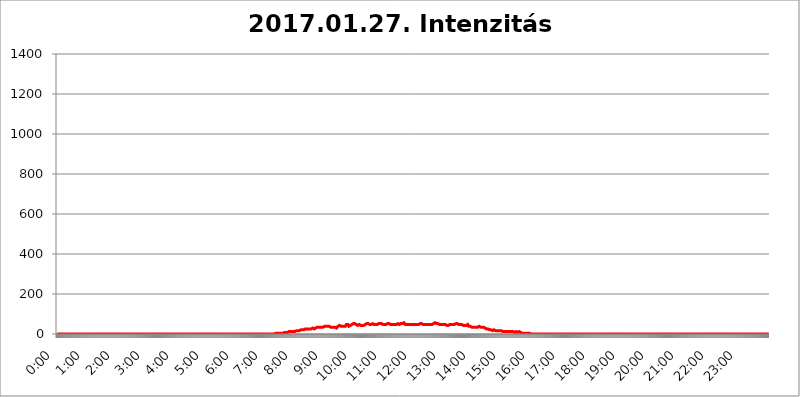
| Category | 2017.01.27. Intenzitás [W/m^2] |
|---|---|
| 0.0 | 0 |
| 0.0006944444444444445 | 0 |
| 0.001388888888888889 | 0 |
| 0.0020833333333333333 | 0 |
| 0.002777777777777778 | 0 |
| 0.003472222222222222 | 0 |
| 0.004166666666666667 | 0 |
| 0.004861111111111111 | 0 |
| 0.005555555555555556 | 0 |
| 0.0062499999999999995 | 0 |
| 0.006944444444444444 | 0 |
| 0.007638888888888889 | 0 |
| 0.008333333333333333 | 0 |
| 0.009027777777777779 | 0 |
| 0.009722222222222222 | 0 |
| 0.010416666666666666 | 0 |
| 0.011111111111111112 | 0 |
| 0.011805555555555555 | 0 |
| 0.012499999999999999 | 0 |
| 0.013194444444444444 | 0 |
| 0.013888888888888888 | 0 |
| 0.014583333333333332 | 0 |
| 0.015277777777777777 | 0 |
| 0.015972222222222224 | 0 |
| 0.016666666666666666 | 0 |
| 0.017361111111111112 | 0 |
| 0.018055555555555557 | 0 |
| 0.01875 | 0 |
| 0.019444444444444445 | 0 |
| 0.02013888888888889 | 0 |
| 0.020833333333333332 | 0 |
| 0.02152777777777778 | 0 |
| 0.022222222222222223 | 0 |
| 0.02291666666666667 | 0 |
| 0.02361111111111111 | 0 |
| 0.024305555555555556 | 0 |
| 0.024999999999999998 | 0 |
| 0.025694444444444447 | 0 |
| 0.02638888888888889 | 0 |
| 0.027083333333333334 | 0 |
| 0.027777777777777776 | 0 |
| 0.02847222222222222 | 0 |
| 0.029166666666666664 | 0 |
| 0.029861111111111113 | 0 |
| 0.030555555555555555 | 0 |
| 0.03125 | 0 |
| 0.03194444444444445 | 0 |
| 0.03263888888888889 | 0 |
| 0.03333333333333333 | 0 |
| 0.034027777777777775 | 0 |
| 0.034722222222222224 | 0 |
| 0.035416666666666666 | 0 |
| 0.036111111111111115 | 0 |
| 0.03680555555555556 | 0 |
| 0.0375 | 0 |
| 0.03819444444444444 | 0 |
| 0.03888888888888889 | 0 |
| 0.03958333333333333 | 0 |
| 0.04027777777777778 | 0 |
| 0.04097222222222222 | 0 |
| 0.041666666666666664 | 0 |
| 0.042361111111111106 | 0 |
| 0.04305555555555556 | 0 |
| 0.043750000000000004 | 0 |
| 0.044444444444444446 | 0 |
| 0.04513888888888889 | 0 |
| 0.04583333333333334 | 0 |
| 0.04652777777777778 | 0 |
| 0.04722222222222222 | 0 |
| 0.04791666666666666 | 0 |
| 0.04861111111111111 | 0 |
| 0.049305555555555554 | 0 |
| 0.049999999999999996 | 0 |
| 0.05069444444444445 | 0 |
| 0.051388888888888894 | 0 |
| 0.052083333333333336 | 0 |
| 0.05277777777777778 | 0 |
| 0.05347222222222222 | 0 |
| 0.05416666666666667 | 0 |
| 0.05486111111111111 | 0 |
| 0.05555555555555555 | 0 |
| 0.05625 | 0 |
| 0.05694444444444444 | 0 |
| 0.057638888888888885 | 0 |
| 0.05833333333333333 | 0 |
| 0.05902777777777778 | 0 |
| 0.059722222222222225 | 0 |
| 0.06041666666666667 | 0 |
| 0.061111111111111116 | 0 |
| 0.06180555555555556 | 0 |
| 0.0625 | 0 |
| 0.06319444444444444 | 0 |
| 0.06388888888888888 | 0 |
| 0.06458333333333334 | 0 |
| 0.06527777777777778 | 0 |
| 0.06597222222222222 | 0 |
| 0.06666666666666667 | 0 |
| 0.06736111111111111 | 0 |
| 0.06805555555555555 | 0 |
| 0.06874999999999999 | 0 |
| 0.06944444444444443 | 0 |
| 0.07013888888888889 | 0 |
| 0.07083333333333333 | 0 |
| 0.07152777777777779 | 0 |
| 0.07222222222222223 | 0 |
| 0.07291666666666667 | 0 |
| 0.07361111111111111 | 0 |
| 0.07430555555555556 | 0 |
| 0.075 | 0 |
| 0.07569444444444444 | 0 |
| 0.0763888888888889 | 0 |
| 0.07708333333333334 | 0 |
| 0.07777777777777778 | 0 |
| 0.07847222222222222 | 0 |
| 0.07916666666666666 | 0 |
| 0.0798611111111111 | 0 |
| 0.08055555555555556 | 0 |
| 0.08125 | 0 |
| 0.08194444444444444 | 0 |
| 0.08263888888888889 | 0 |
| 0.08333333333333333 | 0 |
| 0.08402777777777777 | 0 |
| 0.08472222222222221 | 0 |
| 0.08541666666666665 | 0 |
| 0.08611111111111112 | 0 |
| 0.08680555555555557 | 0 |
| 0.08750000000000001 | 0 |
| 0.08819444444444445 | 0 |
| 0.08888888888888889 | 0 |
| 0.08958333333333333 | 0 |
| 0.09027777777777778 | 0 |
| 0.09097222222222222 | 0 |
| 0.09166666666666667 | 0 |
| 0.09236111111111112 | 0 |
| 0.09305555555555556 | 0 |
| 0.09375 | 0 |
| 0.09444444444444444 | 0 |
| 0.09513888888888888 | 0 |
| 0.09583333333333333 | 0 |
| 0.09652777777777777 | 0 |
| 0.09722222222222222 | 0 |
| 0.09791666666666667 | 0 |
| 0.09861111111111111 | 0 |
| 0.09930555555555555 | 0 |
| 0.09999999999999999 | 0 |
| 0.10069444444444443 | 0 |
| 0.1013888888888889 | 0 |
| 0.10208333333333335 | 0 |
| 0.10277777777777779 | 0 |
| 0.10347222222222223 | 0 |
| 0.10416666666666667 | 0 |
| 0.10486111111111111 | 0 |
| 0.10555555555555556 | 0 |
| 0.10625 | 0 |
| 0.10694444444444444 | 0 |
| 0.1076388888888889 | 0 |
| 0.10833333333333334 | 0 |
| 0.10902777777777778 | 0 |
| 0.10972222222222222 | 0 |
| 0.1111111111111111 | 0 |
| 0.11180555555555556 | 0 |
| 0.11180555555555556 | 0 |
| 0.1125 | 0 |
| 0.11319444444444444 | 0 |
| 0.11388888888888889 | 0 |
| 0.11458333333333333 | 0 |
| 0.11527777777777777 | 0 |
| 0.11597222222222221 | 0 |
| 0.11666666666666665 | 0 |
| 0.1173611111111111 | 0 |
| 0.11805555555555557 | 0 |
| 0.11944444444444445 | 0 |
| 0.12013888888888889 | 0 |
| 0.12083333333333333 | 0 |
| 0.12152777777777778 | 0 |
| 0.12222222222222223 | 0 |
| 0.12291666666666667 | 0 |
| 0.12291666666666667 | 0 |
| 0.12361111111111112 | 0 |
| 0.12430555555555556 | 0 |
| 0.125 | 0 |
| 0.12569444444444444 | 0 |
| 0.12638888888888888 | 0 |
| 0.12708333333333333 | 0 |
| 0.16875 | 0 |
| 0.12847222222222224 | 0 |
| 0.12916666666666668 | 0 |
| 0.12986111111111112 | 0 |
| 0.13055555555555556 | 0 |
| 0.13125 | 0 |
| 0.13194444444444445 | 0 |
| 0.1326388888888889 | 0 |
| 0.13333333333333333 | 0 |
| 0.13402777777777777 | 0 |
| 0.13402777777777777 | 0 |
| 0.13472222222222222 | 0 |
| 0.13541666666666666 | 0 |
| 0.1361111111111111 | 0 |
| 0.13749999999999998 | 0 |
| 0.13819444444444443 | 0 |
| 0.1388888888888889 | 0 |
| 0.13958333333333334 | 0 |
| 0.14027777777777778 | 0 |
| 0.14097222222222222 | 0 |
| 0.14166666666666666 | 0 |
| 0.1423611111111111 | 0 |
| 0.14305555555555557 | 0 |
| 0.14375000000000002 | 0 |
| 0.14444444444444446 | 0 |
| 0.1451388888888889 | 0 |
| 0.1451388888888889 | 0 |
| 0.14652777777777778 | 0 |
| 0.14722222222222223 | 0 |
| 0.14791666666666667 | 0 |
| 0.1486111111111111 | 0 |
| 0.14930555555555555 | 0 |
| 0.15 | 0 |
| 0.15069444444444444 | 0 |
| 0.15138888888888888 | 0 |
| 0.15208333333333332 | 0 |
| 0.15277777777777776 | 0 |
| 0.15347222222222223 | 0 |
| 0.15416666666666667 | 0 |
| 0.15486111111111112 | 0 |
| 0.15555555555555556 | 0 |
| 0.15625 | 0 |
| 0.15694444444444444 | 0 |
| 0.15763888888888888 | 0 |
| 0.15833333333333333 | 0 |
| 0.15902777777777777 | 0 |
| 0.15972222222222224 | 0 |
| 0.16041666666666668 | 0 |
| 0.16111111111111112 | 0 |
| 0.16180555555555556 | 0 |
| 0.1625 | 0 |
| 0.16319444444444445 | 0 |
| 0.1638888888888889 | 0 |
| 0.16458333333333333 | 0 |
| 0.16527777777777777 | 0 |
| 0.16597222222222222 | 0 |
| 0.16666666666666666 | 0 |
| 0.1673611111111111 | 0 |
| 0.16805555555555554 | 0 |
| 0.16874999999999998 | 0 |
| 0.16944444444444443 | 0 |
| 0.17013888888888887 | 0 |
| 0.1708333333333333 | 0 |
| 0.17152777777777775 | 0 |
| 0.17222222222222225 | 0 |
| 0.1729166666666667 | 0 |
| 0.17361111111111113 | 0 |
| 0.17430555555555557 | 0 |
| 0.17500000000000002 | 0 |
| 0.17569444444444446 | 0 |
| 0.1763888888888889 | 0 |
| 0.17708333333333334 | 0 |
| 0.17777777777777778 | 0 |
| 0.17847222222222223 | 0 |
| 0.17916666666666667 | 0 |
| 0.1798611111111111 | 0 |
| 0.18055555555555555 | 0 |
| 0.18125 | 0 |
| 0.18194444444444444 | 0 |
| 0.1826388888888889 | 0 |
| 0.18333333333333335 | 0 |
| 0.1840277777777778 | 0 |
| 0.18472222222222223 | 0 |
| 0.18541666666666667 | 0 |
| 0.18611111111111112 | 0 |
| 0.18680555555555556 | 0 |
| 0.1875 | 0 |
| 0.18819444444444444 | 0 |
| 0.18888888888888888 | 0 |
| 0.18958333333333333 | 0 |
| 0.19027777777777777 | 0 |
| 0.1909722222222222 | 0 |
| 0.19166666666666665 | 0 |
| 0.19236111111111112 | 0 |
| 0.19305555555555554 | 0 |
| 0.19375 | 0 |
| 0.19444444444444445 | 0 |
| 0.1951388888888889 | 0 |
| 0.19583333333333333 | 0 |
| 0.19652777777777777 | 0 |
| 0.19722222222222222 | 0 |
| 0.19791666666666666 | 0 |
| 0.1986111111111111 | 0 |
| 0.19930555555555554 | 0 |
| 0.19999999999999998 | 0 |
| 0.20069444444444443 | 0 |
| 0.20138888888888887 | 0 |
| 0.2020833333333333 | 0 |
| 0.2027777777777778 | 0 |
| 0.2034722222222222 | 0 |
| 0.2041666666666667 | 0 |
| 0.20486111111111113 | 0 |
| 0.20555555555555557 | 0 |
| 0.20625000000000002 | 0 |
| 0.20694444444444446 | 0 |
| 0.2076388888888889 | 0 |
| 0.20833333333333334 | 0 |
| 0.20902777777777778 | 0 |
| 0.20972222222222223 | 0 |
| 0.21041666666666667 | 0 |
| 0.2111111111111111 | 0 |
| 0.21180555555555555 | 0 |
| 0.2125 | 0 |
| 0.21319444444444444 | 0 |
| 0.2138888888888889 | 0 |
| 0.21458333333333335 | 0 |
| 0.2152777777777778 | 0 |
| 0.21597222222222223 | 0 |
| 0.21666666666666667 | 0 |
| 0.21736111111111112 | 0 |
| 0.21805555555555556 | 0 |
| 0.21875 | 0 |
| 0.21944444444444444 | 0 |
| 0.22013888888888888 | 0 |
| 0.22083333333333333 | 0 |
| 0.22152777777777777 | 0 |
| 0.2222222222222222 | 0 |
| 0.22291666666666665 | 0 |
| 0.2236111111111111 | 0 |
| 0.22430555555555556 | 0 |
| 0.225 | 0 |
| 0.22569444444444445 | 0 |
| 0.2263888888888889 | 0 |
| 0.22708333333333333 | 0 |
| 0.22777777777777777 | 0 |
| 0.22847222222222222 | 0 |
| 0.22916666666666666 | 0 |
| 0.2298611111111111 | 0 |
| 0.23055555555555554 | 0 |
| 0.23124999999999998 | 0 |
| 0.23194444444444443 | 0 |
| 0.23263888888888887 | 0 |
| 0.2333333333333333 | 0 |
| 0.2340277777777778 | 0 |
| 0.2347222222222222 | 0 |
| 0.2354166666666667 | 0 |
| 0.23611111111111113 | 0 |
| 0.23680555555555557 | 0 |
| 0.23750000000000002 | 0 |
| 0.23819444444444446 | 0 |
| 0.2388888888888889 | 0 |
| 0.23958333333333334 | 0 |
| 0.24027777777777778 | 0 |
| 0.24097222222222223 | 0 |
| 0.24166666666666667 | 0 |
| 0.2423611111111111 | 0 |
| 0.24305555555555555 | 0 |
| 0.24375 | 0 |
| 0.24444444444444446 | 0 |
| 0.24513888888888888 | 0 |
| 0.24583333333333335 | 0 |
| 0.2465277777777778 | 0 |
| 0.24722222222222223 | 0 |
| 0.24791666666666667 | 0 |
| 0.24861111111111112 | 0 |
| 0.24930555555555556 | 0 |
| 0.25 | 0 |
| 0.25069444444444444 | 0 |
| 0.2513888888888889 | 0 |
| 0.2520833333333333 | 0 |
| 0.25277777777777777 | 0 |
| 0.2534722222222222 | 0 |
| 0.25416666666666665 | 0 |
| 0.2548611111111111 | 0 |
| 0.2555555555555556 | 0 |
| 0.25625000000000003 | 0 |
| 0.2569444444444445 | 0 |
| 0.2576388888888889 | 0 |
| 0.25833333333333336 | 0 |
| 0.2590277777777778 | 0 |
| 0.25972222222222224 | 0 |
| 0.2604166666666667 | 0 |
| 0.2611111111111111 | 0 |
| 0.26180555555555557 | 0 |
| 0.2625 | 0 |
| 0.26319444444444445 | 0 |
| 0.2638888888888889 | 0 |
| 0.26458333333333334 | 0 |
| 0.2652777777777778 | 0 |
| 0.2659722222222222 | 0 |
| 0.26666666666666666 | 0 |
| 0.2673611111111111 | 0 |
| 0.26805555555555555 | 0 |
| 0.26875 | 0 |
| 0.26944444444444443 | 0 |
| 0.2701388888888889 | 0 |
| 0.2708333333333333 | 0 |
| 0.27152777777777776 | 0 |
| 0.2722222222222222 | 0 |
| 0.27291666666666664 | 0 |
| 0.2736111111111111 | 0 |
| 0.2743055555555555 | 0 |
| 0.27499999999999997 | 0 |
| 0.27569444444444446 | 0 |
| 0.27638888888888885 | 0 |
| 0.27708333333333335 | 0 |
| 0.2777777777777778 | 0 |
| 0.27847222222222223 | 0 |
| 0.2791666666666667 | 0 |
| 0.2798611111111111 | 0 |
| 0.28055555555555556 | 0 |
| 0.28125 | 0 |
| 0.28194444444444444 | 0 |
| 0.2826388888888889 | 0 |
| 0.2833333333333333 | 0 |
| 0.28402777777777777 | 0 |
| 0.2847222222222222 | 0 |
| 0.28541666666666665 | 0 |
| 0.28611111111111115 | 0 |
| 0.28680555555555554 | 0 |
| 0.28750000000000003 | 0 |
| 0.2881944444444445 | 0 |
| 0.2888888888888889 | 0 |
| 0.28958333333333336 | 0 |
| 0.2902777777777778 | 0 |
| 0.29097222222222224 | 0 |
| 0.2916666666666667 | 0 |
| 0.2923611111111111 | 0 |
| 0.29305555555555557 | 0 |
| 0.29375 | 0 |
| 0.29444444444444445 | 0 |
| 0.2951388888888889 | 0 |
| 0.29583333333333334 | 0 |
| 0.2965277777777778 | 0 |
| 0.2972222222222222 | 0 |
| 0.29791666666666666 | 0 |
| 0.2986111111111111 | 0 |
| 0.29930555555555555 | 0 |
| 0.3 | 0 |
| 0.30069444444444443 | 0 |
| 0.3013888888888889 | 0 |
| 0.3020833333333333 | 0 |
| 0.30277777777777776 | 0 |
| 0.3034722222222222 | 0 |
| 0.30416666666666664 | 0 |
| 0.3048611111111111 | 0 |
| 0.3055555555555555 | 0 |
| 0.30624999999999997 | 3.525 |
| 0.3069444444444444 | 3.525 |
| 0.3076388888888889 | 3.525 |
| 0.30833333333333335 | 3.525 |
| 0.3090277777777778 | 3.525 |
| 0.30972222222222223 | 3.525 |
| 0.3104166666666667 | 3.525 |
| 0.3111111111111111 | 3.525 |
| 0.31180555555555556 | 3.525 |
| 0.3125 | 3.525 |
| 0.31319444444444444 | 3.525 |
| 0.3138888888888889 | 3.525 |
| 0.3145833333333333 | 3.525 |
| 0.31527777777777777 | 3.525 |
| 0.3159722222222222 | 3.525 |
| 0.31666666666666665 | 3.525 |
| 0.31736111111111115 | 7.887 |
| 0.31805555555555554 | 7.887 |
| 0.31875000000000003 | 7.887 |
| 0.3194444444444445 | 7.887 |
| 0.3201388888888889 | 7.887 |
| 0.32083333333333336 | 7.887 |
| 0.3215277777777778 | 7.887 |
| 0.32222222222222224 | 7.887 |
| 0.3229166666666667 | 7.887 |
| 0.3236111111111111 | 7.887 |
| 0.32430555555555557 | 7.887 |
| 0.325 | 12.257 |
| 0.32569444444444445 | 12.257 |
| 0.3263888888888889 | 7.887 |
| 0.32708333333333334 | 12.257 |
| 0.3277777777777778 | 12.257 |
| 0.3284722222222222 | 12.257 |
| 0.32916666666666666 | 12.257 |
| 0.3298611111111111 | 12.257 |
| 0.33055555555555555 | 12.257 |
| 0.33125 | 12.257 |
| 0.33194444444444443 | 12.257 |
| 0.3326388888888889 | 12.257 |
| 0.3333333333333333 | 12.257 |
| 0.3340277777777778 | 12.257 |
| 0.3347222222222222 | 12.257 |
| 0.3354166666666667 | 16.636 |
| 0.3361111111111111 | 16.636 |
| 0.3368055555555556 | 16.636 |
| 0.33749999999999997 | 16.636 |
| 0.33819444444444446 | 16.636 |
| 0.33888888888888885 | 16.636 |
| 0.33958333333333335 | 16.636 |
| 0.34027777777777773 | 16.636 |
| 0.34097222222222223 | 21.024 |
| 0.3416666666666666 | 21.024 |
| 0.3423611111111111 | 21.024 |
| 0.3430555555555555 | 21.024 |
| 0.34375 | 21.024 |
| 0.3444444444444445 | 21.024 |
| 0.3451388888888889 | 21.024 |
| 0.3458333333333334 | 21.024 |
| 0.34652777777777777 | 21.024 |
| 0.34722222222222227 | 21.024 |
| 0.34791666666666665 | 25.419 |
| 0.34861111111111115 | 25.419 |
| 0.34930555555555554 | 21.024 |
| 0.35000000000000003 | 25.419 |
| 0.3506944444444444 | 25.419 |
| 0.3513888888888889 | 21.024 |
| 0.3520833333333333 | 25.419 |
| 0.3527777777777778 | 25.419 |
| 0.3534722222222222 | 25.419 |
| 0.3541666666666667 | 25.419 |
| 0.3548611111111111 | 25.419 |
| 0.35555555555555557 | 25.419 |
| 0.35625 | 25.419 |
| 0.35694444444444445 | 29.823 |
| 0.3576388888888889 | 29.823 |
| 0.35833333333333334 | 29.823 |
| 0.3590277777777778 | 29.823 |
| 0.3597222222222222 | 29.823 |
| 0.36041666666666666 | 25.419 |
| 0.3611111111111111 | 29.823 |
| 0.36180555555555555 | 29.823 |
| 0.3625 | 29.823 |
| 0.36319444444444443 | 29.823 |
| 0.3638888888888889 | 34.234 |
| 0.3645833333333333 | 34.234 |
| 0.3652777777777778 | 34.234 |
| 0.3659722222222222 | 34.234 |
| 0.3666666666666667 | 34.234 |
| 0.3673611111111111 | 38.653 |
| 0.3680555555555556 | 38.653 |
| 0.36874999999999997 | 34.234 |
| 0.36944444444444446 | 34.234 |
| 0.37013888888888885 | 38.653 |
| 0.37083333333333335 | 34.234 |
| 0.37152777777777773 | 34.234 |
| 0.37222222222222223 | 34.234 |
| 0.3729166666666666 | 34.234 |
| 0.3736111111111111 | 34.234 |
| 0.3743055555555555 | 38.653 |
| 0.375 | 38.653 |
| 0.3756944444444445 | 38.653 |
| 0.3763888888888889 | 38.653 |
| 0.3770833333333334 | 38.653 |
| 0.37777777777777777 | 38.653 |
| 0.37847222222222227 | 38.653 |
| 0.37916666666666665 | 38.653 |
| 0.37986111111111115 | 38.653 |
| 0.38055555555555554 | 38.653 |
| 0.38125000000000003 | 38.653 |
| 0.3819444444444444 | 38.653 |
| 0.3826388888888889 | 34.234 |
| 0.3833333333333333 | 34.234 |
| 0.3840277777777778 | 38.653 |
| 0.3847222222222222 | 34.234 |
| 0.3854166666666667 | 34.234 |
| 0.3861111111111111 | 34.234 |
| 0.38680555555555557 | 34.234 |
| 0.3875 | 34.234 |
| 0.38819444444444445 | 34.234 |
| 0.3888888888888889 | 29.823 |
| 0.38958333333333334 | 34.234 |
| 0.3902777777777778 | 29.823 |
| 0.3909722222222222 | 29.823 |
| 0.39166666666666666 | 29.823 |
| 0.3923611111111111 | 34.234 |
| 0.39305555555555555 | 34.234 |
| 0.39375 | 38.653 |
| 0.39444444444444443 | 38.653 |
| 0.3951388888888889 | 38.653 |
| 0.3958333333333333 | 43.079 |
| 0.3965277777777778 | 43.079 |
| 0.3972222222222222 | 43.079 |
| 0.3979166666666667 | 38.653 |
| 0.3986111111111111 | 38.653 |
| 0.3993055555555556 | 38.653 |
| 0.39999999999999997 | 38.653 |
| 0.40069444444444446 | 38.653 |
| 0.40138888888888885 | 38.653 |
| 0.40208333333333335 | 38.653 |
| 0.40277777777777773 | 38.653 |
| 0.40347222222222223 | 38.653 |
| 0.4041666666666666 | 38.653 |
| 0.4048611111111111 | 43.079 |
| 0.4055555555555555 | 47.511 |
| 0.40625 | 47.511 |
| 0.4069444444444445 | 47.511 |
| 0.4076388888888889 | 47.511 |
| 0.4083333333333334 | 43.079 |
| 0.40902777777777777 | 38.653 |
| 0.40972222222222227 | 38.653 |
| 0.41041666666666665 | 43.079 |
| 0.41111111111111115 | 43.079 |
| 0.41180555555555554 | 47.511 |
| 0.41250000000000003 | 47.511 |
| 0.4131944444444444 | 47.511 |
| 0.4138888888888889 | 47.511 |
| 0.4145833333333333 | 51.951 |
| 0.4152777777777778 | 51.951 |
| 0.4159722222222222 | 51.951 |
| 0.4166666666666667 | 51.951 |
| 0.4173611111111111 | 51.951 |
| 0.41805555555555557 | 47.511 |
| 0.41875 | 47.511 |
| 0.41944444444444445 | 47.511 |
| 0.4201388888888889 | 47.511 |
| 0.42083333333333334 | 47.511 |
| 0.4215277777777778 | 43.079 |
| 0.4222222222222222 | 47.511 |
| 0.42291666666666666 | 47.511 |
| 0.4236111111111111 | 47.511 |
| 0.42430555555555555 | 47.511 |
| 0.425 | 47.511 |
| 0.42569444444444443 | 43.079 |
| 0.4263888888888889 | 43.079 |
| 0.4270833333333333 | 43.079 |
| 0.4277777777777778 | 43.079 |
| 0.4284722222222222 | 43.079 |
| 0.4291666666666667 | 43.079 |
| 0.4298611111111111 | 43.079 |
| 0.4305555555555556 | 43.079 |
| 0.43124999999999997 | 43.079 |
| 0.43194444444444446 | 47.511 |
| 0.43263888888888885 | 47.511 |
| 0.43333333333333335 | 47.511 |
| 0.43402777777777773 | 51.951 |
| 0.43472222222222223 | 51.951 |
| 0.4354166666666666 | 51.951 |
| 0.4361111111111111 | 51.951 |
| 0.4368055555555555 | 47.511 |
| 0.4375 | 51.951 |
| 0.4381944444444445 | 47.511 |
| 0.4388888888888889 | 51.951 |
| 0.4395833333333334 | 51.951 |
| 0.44027777777777777 | 47.511 |
| 0.44097222222222227 | 51.951 |
| 0.44166666666666665 | 51.951 |
| 0.44236111111111115 | 51.951 |
| 0.44305555555555554 | 47.511 |
| 0.44375000000000003 | 47.511 |
| 0.4444444444444444 | 47.511 |
| 0.4451388888888889 | 47.511 |
| 0.4458333333333333 | 47.511 |
| 0.4465277777777778 | 47.511 |
| 0.4472222222222222 | 47.511 |
| 0.4479166666666667 | 47.511 |
| 0.4486111111111111 | 47.511 |
| 0.44930555555555557 | 47.511 |
| 0.45 | 47.511 |
| 0.45069444444444445 | 51.951 |
| 0.4513888888888889 | 51.951 |
| 0.45208333333333334 | 51.951 |
| 0.4527777777777778 | 51.951 |
| 0.4534722222222222 | 51.951 |
| 0.45416666666666666 | 47.511 |
| 0.4548611111111111 | 51.951 |
| 0.45555555555555555 | 51.951 |
| 0.45625 | 47.511 |
| 0.45694444444444443 | 47.511 |
| 0.4576388888888889 | 47.511 |
| 0.4583333333333333 | 47.511 |
| 0.4590277777777778 | 47.511 |
| 0.4597222222222222 | 47.511 |
| 0.4604166666666667 | 47.511 |
| 0.4611111111111111 | 47.511 |
| 0.4618055555555556 | 47.511 |
| 0.46249999999999997 | 51.951 |
| 0.46319444444444446 | 51.951 |
| 0.46388888888888885 | 56.398 |
| 0.46458333333333335 | 56.398 |
| 0.46527777777777773 | 51.951 |
| 0.46597222222222223 | 47.511 |
| 0.4666666666666666 | 47.511 |
| 0.4673611111111111 | 47.511 |
| 0.4680555555555555 | 47.511 |
| 0.46875 | 47.511 |
| 0.4694444444444445 | 47.511 |
| 0.4701388888888889 | 47.511 |
| 0.4708333333333334 | 47.511 |
| 0.47152777777777777 | 47.511 |
| 0.47222222222222227 | 47.511 |
| 0.47291666666666665 | 47.511 |
| 0.47361111111111115 | 47.511 |
| 0.47430555555555554 | 47.511 |
| 0.47500000000000003 | 47.511 |
| 0.4756944444444444 | 47.511 |
| 0.4763888888888889 | 47.511 |
| 0.4770833333333333 | 51.951 |
| 0.4777777777777778 | 51.951 |
| 0.4784722222222222 | 47.511 |
| 0.4791666666666667 | 47.511 |
| 0.4798611111111111 | 47.511 |
| 0.48055555555555557 | 51.951 |
| 0.48125 | 47.511 |
| 0.48194444444444445 | 51.951 |
| 0.4826388888888889 | 51.951 |
| 0.48333333333333334 | 51.951 |
| 0.4840277777777778 | 51.951 |
| 0.4847222222222222 | 51.951 |
| 0.48541666666666666 | 56.398 |
| 0.4861111111111111 | 56.398 |
| 0.48680555555555555 | 56.398 |
| 0.4875 | 51.951 |
| 0.48819444444444443 | 47.511 |
| 0.4888888888888889 | 47.511 |
| 0.4895833333333333 | 47.511 |
| 0.4902777777777778 | 47.511 |
| 0.4909722222222222 | 47.511 |
| 0.4916666666666667 | 47.511 |
| 0.4923611111111111 | 47.511 |
| 0.4930555555555556 | 47.511 |
| 0.49374999999999997 | 47.511 |
| 0.49444444444444446 | 47.511 |
| 0.49513888888888885 | 47.511 |
| 0.49583333333333335 | 47.511 |
| 0.49652777777777773 | 47.511 |
| 0.49722222222222223 | 47.511 |
| 0.4979166666666666 | 51.951 |
| 0.4986111111111111 | 47.511 |
| 0.4993055555555555 | 47.511 |
| 0.5 | 47.511 |
| 0.5006944444444444 | 47.511 |
| 0.5013888888888889 | 47.511 |
| 0.5020833333333333 | 47.511 |
| 0.5027777777777778 | 47.511 |
| 0.5034722222222222 | 47.511 |
| 0.5041666666666667 | 47.511 |
| 0.5048611111111111 | 47.511 |
| 0.5055555555555555 | 47.511 |
| 0.50625 | 47.511 |
| 0.5069444444444444 | 47.511 |
| 0.5076388888888889 | 47.511 |
| 0.5083333333333333 | 51.951 |
| 0.5090277777777777 | 51.951 |
| 0.5097222222222222 | 51.951 |
| 0.5104166666666666 | 51.951 |
| 0.5111111111111112 | 51.951 |
| 0.5118055555555555 | 51.951 |
| 0.5125000000000001 | 51.951 |
| 0.5131944444444444 | 47.511 |
| 0.513888888888889 | 47.511 |
| 0.5145833333333333 | 47.511 |
| 0.5152777777777778 | 47.511 |
| 0.5159722222222222 | 47.511 |
| 0.5166666666666667 | 47.511 |
| 0.517361111111111 | 47.511 |
| 0.5180555555555556 | 47.511 |
| 0.5187499999999999 | 47.511 |
| 0.5194444444444445 | 47.511 |
| 0.5201388888888888 | 47.511 |
| 0.5208333333333334 | 47.511 |
| 0.5215277777777778 | 47.511 |
| 0.5222222222222223 | 47.511 |
| 0.5229166666666667 | 47.511 |
| 0.5236111111111111 | 47.511 |
| 0.5243055555555556 | 47.511 |
| 0.525 | 47.511 |
| 0.5256944444444445 | 47.511 |
| 0.5263888888888889 | 51.951 |
| 0.5270833333333333 | 51.951 |
| 0.5277777777777778 | 51.951 |
| 0.5284722222222222 | 56.398 |
| 0.5291666666666667 | 56.398 |
| 0.5298611111111111 | 56.398 |
| 0.5305555555555556 | 56.398 |
| 0.53125 | 51.951 |
| 0.5319444444444444 | 51.951 |
| 0.5326388888888889 | 51.951 |
| 0.5333333333333333 | 51.951 |
| 0.5340277777777778 | 51.951 |
| 0.5347222222222222 | 47.511 |
| 0.5354166666666667 | 47.511 |
| 0.5361111111111111 | 47.511 |
| 0.5368055555555555 | 47.511 |
| 0.5375 | 47.511 |
| 0.5381944444444444 | 47.511 |
| 0.5388888888888889 | 47.511 |
| 0.5395833333333333 | 47.511 |
| 0.5402777777777777 | 47.511 |
| 0.5409722222222222 | 47.511 |
| 0.5416666666666666 | 47.511 |
| 0.5423611111111112 | 47.511 |
| 0.5430555555555555 | 47.511 |
| 0.5437500000000001 | 47.511 |
| 0.5444444444444444 | 47.511 |
| 0.545138888888889 | 43.079 |
| 0.5458333333333333 | 43.079 |
| 0.5465277777777778 | 43.079 |
| 0.5472222222222222 | 43.079 |
| 0.5479166666666667 | 43.079 |
| 0.548611111111111 | 43.079 |
| 0.5493055555555556 | 47.511 |
| 0.5499999999999999 | 47.511 |
| 0.5506944444444445 | 47.511 |
| 0.5513888888888888 | 47.511 |
| 0.5520833333333334 | 47.511 |
| 0.5527777777777778 | 47.511 |
| 0.5534722222222223 | 47.511 |
| 0.5541666666666667 | 47.511 |
| 0.5548611111111111 | 47.511 |
| 0.5555555555555556 | 47.511 |
| 0.55625 | 47.511 |
| 0.5569444444444445 | 47.511 |
| 0.5576388888888889 | 51.951 |
| 0.5583333333333333 | 51.951 |
| 0.5590277777777778 | 51.951 |
| 0.5597222222222222 | 51.951 |
| 0.5604166666666667 | 51.951 |
| 0.5611111111111111 | 51.951 |
| 0.5618055555555556 | 51.951 |
| 0.5625 | 47.511 |
| 0.5631944444444444 | 47.511 |
| 0.5638888888888889 | 47.511 |
| 0.5645833333333333 | 47.511 |
| 0.5652777777777778 | 47.511 |
| 0.5659722222222222 | 47.511 |
| 0.5666666666666667 | 47.511 |
| 0.5673611111111111 | 47.511 |
| 0.5680555555555555 | 47.511 |
| 0.56875 | 47.511 |
| 0.5694444444444444 | 43.079 |
| 0.5701388888888889 | 43.079 |
| 0.5708333333333333 | 43.079 |
| 0.5715277777777777 | 43.079 |
| 0.5722222222222222 | 43.079 |
| 0.5729166666666666 | 43.079 |
| 0.5736111111111112 | 43.079 |
| 0.5743055555555555 | 43.079 |
| 0.5750000000000001 | 47.511 |
| 0.5756944444444444 | 47.511 |
| 0.576388888888889 | 43.079 |
| 0.5770833333333333 | 38.653 |
| 0.5777777777777778 | 38.653 |
| 0.5784722222222222 | 38.653 |
| 0.5791666666666667 | 38.653 |
| 0.579861111111111 | 38.653 |
| 0.5805555555555556 | 38.653 |
| 0.5812499999999999 | 34.234 |
| 0.5819444444444445 | 34.234 |
| 0.5826388888888888 | 34.234 |
| 0.5833333333333334 | 34.234 |
| 0.5840277777777778 | 29.823 |
| 0.5847222222222223 | 34.234 |
| 0.5854166666666667 | 34.234 |
| 0.5861111111111111 | 34.234 |
| 0.5868055555555556 | 34.234 |
| 0.5875 | 34.234 |
| 0.5881944444444445 | 34.234 |
| 0.5888888888888889 | 38.653 |
| 0.5895833333333333 | 34.234 |
| 0.5902777777777778 | 38.653 |
| 0.5909722222222222 | 38.653 |
| 0.5916666666666667 | 38.653 |
| 0.5923611111111111 | 38.653 |
| 0.5930555555555556 | 38.653 |
| 0.59375 | 34.234 |
| 0.5944444444444444 | 34.234 |
| 0.5951388888888889 | 34.234 |
| 0.5958333333333333 | 34.234 |
| 0.5965277777777778 | 34.234 |
| 0.5972222222222222 | 29.823 |
| 0.5979166666666667 | 34.234 |
| 0.5986111111111111 | 29.823 |
| 0.5993055555555555 | 29.823 |
| 0.6 | 29.823 |
| 0.6006944444444444 | 29.823 |
| 0.6013888888888889 | 29.823 |
| 0.6020833333333333 | 25.419 |
| 0.6027777777777777 | 25.419 |
| 0.6034722222222222 | 25.419 |
| 0.6041666666666666 | 25.419 |
| 0.6048611111111112 | 25.419 |
| 0.6055555555555555 | 21.024 |
| 0.6062500000000001 | 21.024 |
| 0.6069444444444444 | 21.024 |
| 0.607638888888889 | 21.024 |
| 0.6083333333333333 | 21.024 |
| 0.6090277777777778 | 21.024 |
| 0.6097222222222222 | 16.636 |
| 0.6104166666666667 | 16.636 |
| 0.611111111111111 | 16.636 |
| 0.6118055555555556 | 21.024 |
| 0.6124999999999999 | 21.024 |
| 0.6131944444444445 | 21.024 |
| 0.6138888888888888 | 16.636 |
| 0.6145833333333334 | 16.636 |
| 0.6152777777777778 | 16.636 |
| 0.6159722222222223 | 16.636 |
| 0.6166666666666667 | 16.636 |
| 0.6173611111111111 | 16.636 |
| 0.6180555555555556 | 16.636 |
| 0.61875 | 16.636 |
| 0.6194444444444445 | 16.636 |
| 0.6201388888888889 | 16.636 |
| 0.6208333333333333 | 16.636 |
| 0.6215277777777778 | 16.636 |
| 0.6222222222222222 | 12.257 |
| 0.6229166666666667 | 16.636 |
| 0.6236111111111111 | 12.257 |
| 0.6243055555555556 | 12.257 |
| 0.625 | 12.257 |
| 0.6256944444444444 | 12.257 |
| 0.6263888888888889 | 12.257 |
| 0.6270833333333333 | 12.257 |
| 0.6277777777777778 | 12.257 |
| 0.6284722222222222 | 12.257 |
| 0.6291666666666667 | 12.257 |
| 0.6298611111111111 | 12.257 |
| 0.6305555555555555 | 12.257 |
| 0.63125 | 12.257 |
| 0.6319444444444444 | 12.257 |
| 0.6326388888888889 | 12.257 |
| 0.6333333333333333 | 12.257 |
| 0.6340277777777777 | 12.257 |
| 0.6347222222222222 | 12.257 |
| 0.6354166666666666 | 12.257 |
| 0.6361111111111112 | 12.257 |
| 0.6368055555555555 | 12.257 |
| 0.6375000000000001 | 12.257 |
| 0.6381944444444444 | 12.257 |
| 0.638888888888889 | 12.257 |
| 0.6395833333333333 | 12.257 |
| 0.6402777777777778 | 12.257 |
| 0.6409722222222222 | 12.257 |
| 0.6416666666666667 | 7.887 |
| 0.642361111111111 | 12.257 |
| 0.6430555555555556 | 7.887 |
| 0.6437499999999999 | 12.257 |
| 0.6444444444444445 | 12.257 |
| 0.6451388888888888 | 7.887 |
| 0.6458333333333334 | 7.887 |
| 0.6465277777777778 | 7.887 |
| 0.6472222222222223 | 7.887 |
| 0.6479166666666667 | 12.257 |
| 0.6486111111111111 | 7.887 |
| 0.6493055555555556 | 7.887 |
| 0.65 | 7.887 |
| 0.6506944444444445 | 3.525 |
| 0.6513888888888889 | 3.525 |
| 0.6520833333333333 | 3.525 |
| 0.6527777777777778 | 3.525 |
| 0.6534722222222222 | 3.525 |
| 0.6541666666666667 | 3.525 |
| 0.6548611111111111 | 3.525 |
| 0.6555555555555556 | 3.525 |
| 0.65625 | 3.525 |
| 0.6569444444444444 | 3.525 |
| 0.6576388888888889 | 3.525 |
| 0.6583333333333333 | 3.525 |
| 0.6590277777777778 | 3.525 |
| 0.6597222222222222 | 3.525 |
| 0.6604166666666667 | 3.525 |
| 0.6611111111111111 | 3.525 |
| 0.6618055555555555 | 3.525 |
| 0.6625 | 3.525 |
| 0.6631944444444444 | 0 |
| 0.6638888888888889 | 0 |
| 0.6645833333333333 | 0 |
| 0.6652777777777777 | 0 |
| 0.6659722222222222 | 0 |
| 0.6666666666666666 | 0 |
| 0.6673611111111111 | 0 |
| 0.6680555555555556 | 0 |
| 0.6687500000000001 | 0 |
| 0.6694444444444444 | 0 |
| 0.6701388888888888 | 0 |
| 0.6708333333333334 | 0 |
| 0.6715277777777778 | 0 |
| 0.6722222222222222 | 0 |
| 0.6729166666666666 | 0 |
| 0.6736111111111112 | 0 |
| 0.6743055555555556 | 0 |
| 0.6749999999999999 | 0 |
| 0.6756944444444444 | 0 |
| 0.6763888888888889 | 0 |
| 0.6770833333333334 | 0 |
| 0.6777777777777777 | 0 |
| 0.6784722222222223 | 0 |
| 0.6791666666666667 | 0 |
| 0.6798611111111111 | 0 |
| 0.6805555555555555 | 0 |
| 0.68125 | 0 |
| 0.6819444444444445 | 0 |
| 0.6826388888888889 | 0 |
| 0.6833333333333332 | 0 |
| 0.6840277777777778 | 0 |
| 0.6847222222222222 | 0 |
| 0.6854166666666667 | 0 |
| 0.686111111111111 | 0 |
| 0.6868055555555556 | 0 |
| 0.6875 | 0 |
| 0.6881944444444444 | 0 |
| 0.688888888888889 | 0 |
| 0.6895833333333333 | 0 |
| 0.6902777777777778 | 0 |
| 0.6909722222222222 | 0 |
| 0.6916666666666668 | 0 |
| 0.6923611111111111 | 0 |
| 0.6930555555555555 | 0 |
| 0.69375 | 0 |
| 0.6944444444444445 | 0 |
| 0.6951388888888889 | 0 |
| 0.6958333333333333 | 0 |
| 0.6965277777777777 | 0 |
| 0.6972222222222223 | 0 |
| 0.6979166666666666 | 0 |
| 0.6986111111111111 | 0 |
| 0.6993055555555556 | 0 |
| 0.7000000000000001 | 0 |
| 0.7006944444444444 | 0 |
| 0.7013888888888888 | 0 |
| 0.7020833333333334 | 0 |
| 0.7027777777777778 | 0 |
| 0.7034722222222222 | 0 |
| 0.7041666666666666 | 0 |
| 0.7048611111111112 | 0 |
| 0.7055555555555556 | 0 |
| 0.7062499999999999 | 0 |
| 0.7069444444444444 | 0 |
| 0.7076388888888889 | 0 |
| 0.7083333333333334 | 0 |
| 0.7090277777777777 | 0 |
| 0.7097222222222223 | 0 |
| 0.7104166666666667 | 0 |
| 0.7111111111111111 | 0 |
| 0.7118055555555555 | 0 |
| 0.7125 | 0 |
| 0.7131944444444445 | 0 |
| 0.7138888888888889 | 0 |
| 0.7145833333333332 | 0 |
| 0.7152777777777778 | 0 |
| 0.7159722222222222 | 0 |
| 0.7166666666666667 | 0 |
| 0.717361111111111 | 0 |
| 0.7180555555555556 | 0 |
| 0.71875 | 0 |
| 0.7194444444444444 | 0 |
| 0.720138888888889 | 0 |
| 0.7208333333333333 | 0 |
| 0.7215277777777778 | 0 |
| 0.7222222222222222 | 0 |
| 0.7229166666666668 | 0 |
| 0.7236111111111111 | 0 |
| 0.7243055555555555 | 0 |
| 0.725 | 0 |
| 0.7256944444444445 | 0 |
| 0.7263888888888889 | 0 |
| 0.7270833333333333 | 0 |
| 0.7277777777777777 | 0 |
| 0.7284722222222223 | 0 |
| 0.7291666666666666 | 0 |
| 0.7298611111111111 | 0 |
| 0.7305555555555556 | 0 |
| 0.7312500000000001 | 0 |
| 0.7319444444444444 | 0 |
| 0.7326388888888888 | 0 |
| 0.7333333333333334 | 0 |
| 0.7340277777777778 | 0 |
| 0.7347222222222222 | 0 |
| 0.7354166666666666 | 0 |
| 0.7361111111111112 | 0 |
| 0.7368055555555556 | 0 |
| 0.7374999999999999 | 0 |
| 0.7381944444444444 | 0 |
| 0.7388888888888889 | 0 |
| 0.7395833333333334 | 0 |
| 0.7402777777777777 | 0 |
| 0.7409722222222223 | 0 |
| 0.7416666666666667 | 0 |
| 0.7423611111111111 | 0 |
| 0.7430555555555555 | 0 |
| 0.74375 | 0 |
| 0.7444444444444445 | 0 |
| 0.7451388888888889 | 0 |
| 0.7458333333333332 | 0 |
| 0.7465277777777778 | 0 |
| 0.7472222222222222 | 0 |
| 0.7479166666666667 | 0 |
| 0.748611111111111 | 0 |
| 0.7493055555555556 | 0 |
| 0.75 | 0 |
| 0.7506944444444444 | 0 |
| 0.751388888888889 | 0 |
| 0.7520833333333333 | 0 |
| 0.7527777777777778 | 0 |
| 0.7534722222222222 | 0 |
| 0.7541666666666668 | 0 |
| 0.7548611111111111 | 0 |
| 0.7555555555555555 | 0 |
| 0.75625 | 0 |
| 0.7569444444444445 | 0 |
| 0.7576388888888889 | 0 |
| 0.7583333333333333 | 0 |
| 0.7590277777777777 | 0 |
| 0.7597222222222223 | 0 |
| 0.7604166666666666 | 0 |
| 0.7611111111111111 | 0 |
| 0.7618055555555556 | 0 |
| 0.7625000000000001 | 0 |
| 0.7631944444444444 | 0 |
| 0.7638888888888888 | 0 |
| 0.7645833333333334 | 0 |
| 0.7652777777777778 | 0 |
| 0.7659722222222222 | 0 |
| 0.7666666666666666 | 0 |
| 0.7673611111111112 | 0 |
| 0.7680555555555556 | 0 |
| 0.7687499999999999 | 0 |
| 0.7694444444444444 | 0 |
| 0.7701388888888889 | 0 |
| 0.7708333333333334 | 0 |
| 0.7715277777777777 | 0 |
| 0.7722222222222223 | 0 |
| 0.7729166666666667 | 0 |
| 0.7736111111111111 | 0 |
| 0.7743055555555555 | 0 |
| 0.775 | 0 |
| 0.7756944444444445 | 0 |
| 0.7763888888888889 | 0 |
| 0.7770833333333332 | 0 |
| 0.7777777777777778 | 0 |
| 0.7784722222222222 | 0 |
| 0.7791666666666667 | 0 |
| 0.779861111111111 | 0 |
| 0.7805555555555556 | 0 |
| 0.78125 | 0 |
| 0.7819444444444444 | 0 |
| 0.782638888888889 | 0 |
| 0.7833333333333333 | 0 |
| 0.7840277777777778 | 0 |
| 0.7847222222222222 | 0 |
| 0.7854166666666668 | 0 |
| 0.7861111111111111 | 0 |
| 0.7868055555555555 | 0 |
| 0.7875 | 0 |
| 0.7881944444444445 | 0 |
| 0.7888888888888889 | 0 |
| 0.7895833333333333 | 0 |
| 0.7902777777777777 | 0 |
| 0.7909722222222223 | 0 |
| 0.7916666666666666 | 0 |
| 0.7923611111111111 | 0 |
| 0.7930555555555556 | 0 |
| 0.7937500000000001 | 0 |
| 0.7944444444444444 | 0 |
| 0.7951388888888888 | 0 |
| 0.7958333333333334 | 0 |
| 0.7965277777777778 | 0 |
| 0.7972222222222222 | 0 |
| 0.7979166666666666 | 0 |
| 0.7986111111111112 | 0 |
| 0.7993055555555556 | 0 |
| 0.7999999999999999 | 0 |
| 0.8006944444444444 | 0 |
| 0.8013888888888889 | 0 |
| 0.8020833333333334 | 0 |
| 0.8027777777777777 | 0 |
| 0.8034722222222223 | 0 |
| 0.8041666666666667 | 0 |
| 0.8048611111111111 | 0 |
| 0.8055555555555555 | 0 |
| 0.80625 | 0 |
| 0.8069444444444445 | 0 |
| 0.8076388888888889 | 0 |
| 0.8083333333333332 | 0 |
| 0.8090277777777778 | 0 |
| 0.8097222222222222 | 0 |
| 0.8104166666666667 | 0 |
| 0.811111111111111 | 0 |
| 0.8118055555555556 | 0 |
| 0.8125 | 0 |
| 0.8131944444444444 | 0 |
| 0.813888888888889 | 0 |
| 0.8145833333333333 | 0 |
| 0.8152777777777778 | 0 |
| 0.8159722222222222 | 0 |
| 0.8166666666666668 | 0 |
| 0.8173611111111111 | 0 |
| 0.8180555555555555 | 0 |
| 0.81875 | 0 |
| 0.8194444444444445 | 0 |
| 0.8201388888888889 | 0 |
| 0.8208333333333333 | 0 |
| 0.8215277777777777 | 0 |
| 0.8222222222222223 | 0 |
| 0.8229166666666666 | 0 |
| 0.8236111111111111 | 0 |
| 0.8243055555555556 | 0 |
| 0.8250000000000001 | 0 |
| 0.8256944444444444 | 0 |
| 0.8263888888888888 | 0 |
| 0.8270833333333334 | 0 |
| 0.8277777777777778 | 0 |
| 0.8284722222222222 | 0 |
| 0.8291666666666666 | 0 |
| 0.8298611111111112 | 0 |
| 0.8305555555555556 | 0 |
| 0.8312499999999999 | 0 |
| 0.8319444444444444 | 0 |
| 0.8326388888888889 | 0 |
| 0.8333333333333334 | 0 |
| 0.8340277777777777 | 0 |
| 0.8347222222222223 | 0 |
| 0.8354166666666667 | 0 |
| 0.8361111111111111 | 0 |
| 0.8368055555555555 | 0 |
| 0.8375 | 0 |
| 0.8381944444444445 | 0 |
| 0.8388888888888889 | 0 |
| 0.8395833333333332 | 0 |
| 0.8402777777777778 | 0 |
| 0.8409722222222222 | 0 |
| 0.8416666666666667 | 0 |
| 0.842361111111111 | 0 |
| 0.8430555555555556 | 0 |
| 0.84375 | 0 |
| 0.8444444444444444 | 0 |
| 0.845138888888889 | 0 |
| 0.8458333333333333 | 0 |
| 0.8465277777777778 | 0 |
| 0.8472222222222222 | 0 |
| 0.8479166666666668 | 0 |
| 0.8486111111111111 | 0 |
| 0.8493055555555555 | 0 |
| 0.85 | 0 |
| 0.8506944444444445 | 0 |
| 0.8513888888888889 | 0 |
| 0.8520833333333333 | 0 |
| 0.8527777777777777 | 0 |
| 0.8534722222222223 | 0 |
| 0.8541666666666666 | 0 |
| 0.8548611111111111 | 0 |
| 0.8555555555555556 | 0 |
| 0.8562500000000001 | 0 |
| 0.8569444444444444 | 0 |
| 0.8576388888888888 | 0 |
| 0.8583333333333334 | 0 |
| 0.8590277777777778 | 0 |
| 0.8597222222222222 | 0 |
| 0.8604166666666666 | 0 |
| 0.8611111111111112 | 0 |
| 0.8618055555555556 | 0 |
| 0.8624999999999999 | 0 |
| 0.8631944444444444 | 0 |
| 0.8638888888888889 | 0 |
| 0.8645833333333334 | 0 |
| 0.8652777777777777 | 0 |
| 0.8659722222222223 | 0 |
| 0.8666666666666667 | 0 |
| 0.8673611111111111 | 0 |
| 0.8680555555555555 | 0 |
| 0.86875 | 0 |
| 0.8694444444444445 | 0 |
| 0.8701388888888889 | 0 |
| 0.8708333333333332 | 0 |
| 0.8715277777777778 | 0 |
| 0.8722222222222222 | 0 |
| 0.8729166666666667 | 0 |
| 0.873611111111111 | 0 |
| 0.8743055555555556 | 0 |
| 0.875 | 0 |
| 0.8756944444444444 | 0 |
| 0.876388888888889 | 0 |
| 0.8770833333333333 | 0 |
| 0.8777777777777778 | 0 |
| 0.8784722222222222 | 0 |
| 0.8791666666666668 | 0 |
| 0.8798611111111111 | 0 |
| 0.8805555555555555 | 0 |
| 0.88125 | 0 |
| 0.8819444444444445 | 0 |
| 0.8826388888888889 | 0 |
| 0.8833333333333333 | 0 |
| 0.8840277777777777 | 0 |
| 0.8847222222222223 | 0 |
| 0.8854166666666666 | 0 |
| 0.8861111111111111 | 0 |
| 0.8868055555555556 | 0 |
| 0.8875000000000001 | 0 |
| 0.8881944444444444 | 0 |
| 0.8888888888888888 | 0 |
| 0.8895833333333334 | 0 |
| 0.8902777777777778 | 0 |
| 0.8909722222222222 | 0 |
| 0.8916666666666666 | 0 |
| 0.8923611111111112 | 0 |
| 0.8930555555555556 | 0 |
| 0.8937499999999999 | 0 |
| 0.8944444444444444 | 0 |
| 0.8951388888888889 | 0 |
| 0.8958333333333334 | 0 |
| 0.8965277777777777 | 0 |
| 0.8972222222222223 | 0 |
| 0.8979166666666667 | 0 |
| 0.8986111111111111 | 0 |
| 0.8993055555555555 | 0 |
| 0.9 | 0 |
| 0.9006944444444445 | 0 |
| 0.9013888888888889 | 0 |
| 0.9020833333333332 | 0 |
| 0.9027777777777778 | 0 |
| 0.9034722222222222 | 0 |
| 0.9041666666666667 | 0 |
| 0.904861111111111 | 0 |
| 0.9055555555555556 | 0 |
| 0.90625 | 0 |
| 0.9069444444444444 | 0 |
| 0.907638888888889 | 0 |
| 0.9083333333333333 | 0 |
| 0.9090277777777778 | 0 |
| 0.9097222222222222 | 0 |
| 0.9104166666666668 | 0 |
| 0.9111111111111111 | 0 |
| 0.9118055555555555 | 0 |
| 0.9125 | 0 |
| 0.9131944444444445 | 0 |
| 0.9138888888888889 | 0 |
| 0.9145833333333333 | 0 |
| 0.9152777777777777 | 0 |
| 0.9159722222222223 | 0 |
| 0.9166666666666666 | 0 |
| 0.9173611111111111 | 0 |
| 0.9180555555555556 | 0 |
| 0.9187500000000001 | 0 |
| 0.9194444444444444 | 0 |
| 0.9201388888888888 | 0 |
| 0.9208333333333334 | 0 |
| 0.9215277777777778 | 0 |
| 0.9222222222222222 | 0 |
| 0.9229166666666666 | 0 |
| 0.9236111111111112 | 0 |
| 0.9243055555555556 | 0 |
| 0.9249999999999999 | 0 |
| 0.9256944444444444 | 0 |
| 0.9263888888888889 | 0 |
| 0.9270833333333334 | 0 |
| 0.9277777777777777 | 0 |
| 0.9284722222222223 | 0 |
| 0.9291666666666667 | 0 |
| 0.9298611111111111 | 0 |
| 0.9305555555555555 | 0 |
| 0.93125 | 0 |
| 0.9319444444444445 | 0 |
| 0.9326388888888889 | 0 |
| 0.9333333333333332 | 0 |
| 0.9340277777777778 | 0 |
| 0.9347222222222222 | 0 |
| 0.9354166666666667 | 0 |
| 0.936111111111111 | 0 |
| 0.9368055555555556 | 0 |
| 0.9375 | 0 |
| 0.9381944444444444 | 0 |
| 0.938888888888889 | 0 |
| 0.9395833333333333 | 0 |
| 0.9402777777777778 | 0 |
| 0.9409722222222222 | 0 |
| 0.9416666666666668 | 0 |
| 0.9423611111111111 | 0 |
| 0.9430555555555555 | 0 |
| 0.94375 | 0 |
| 0.9444444444444445 | 0 |
| 0.9451388888888889 | 0 |
| 0.9458333333333333 | 0 |
| 0.9465277777777777 | 0 |
| 0.9472222222222223 | 0 |
| 0.9479166666666666 | 0 |
| 0.9486111111111111 | 0 |
| 0.9493055555555556 | 0 |
| 0.9500000000000001 | 0 |
| 0.9506944444444444 | 0 |
| 0.9513888888888888 | 0 |
| 0.9520833333333334 | 0 |
| 0.9527777777777778 | 0 |
| 0.9534722222222222 | 0 |
| 0.9541666666666666 | 0 |
| 0.9548611111111112 | 0 |
| 0.9555555555555556 | 0 |
| 0.9562499999999999 | 0 |
| 0.9569444444444444 | 0 |
| 0.9576388888888889 | 0 |
| 0.9583333333333334 | 0 |
| 0.9590277777777777 | 0 |
| 0.9597222222222223 | 0 |
| 0.9604166666666667 | 0 |
| 0.9611111111111111 | 0 |
| 0.9618055555555555 | 0 |
| 0.9625 | 0 |
| 0.9631944444444445 | 0 |
| 0.9638888888888889 | 0 |
| 0.9645833333333332 | 0 |
| 0.9652777777777778 | 0 |
| 0.9659722222222222 | 0 |
| 0.9666666666666667 | 0 |
| 0.967361111111111 | 0 |
| 0.9680555555555556 | 0 |
| 0.96875 | 0 |
| 0.9694444444444444 | 0 |
| 0.970138888888889 | 0 |
| 0.9708333333333333 | 0 |
| 0.9715277777777778 | 0 |
| 0.9722222222222222 | 0 |
| 0.9729166666666668 | 0 |
| 0.9736111111111111 | 0 |
| 0.9743055555555555 | 0 |
| 0.975 | 0 |
| 0.9756944444444445 | 0 |
| 0.9763888888888889 | 0 |
| 0.9770833333333333 | 0 |
| 0.9777777777777777 | 0 |
| 0.9784722222222223 | 0 |
| 0.9791666666666666 | 0 |
| 0.9798611111111111 | 0 |
| 0.9805555555555556 | 0 |
| 0.9812500000000001 | 0 |
| 0.9819444444444444 | 0 |
| 0.9826388888888888 | 0 |
| 0.9833333333333334 | 0 |
| 0.9840277777777778 | 0 |
| 0.9847222222222222 | 0 |
| 0.9854166666666666 | 0 |
| 0.9861111111111112 | 0 |
| 0.9868055555555556 | 0 |
| 0.9874999999999999 | 0 |
| 0.9881944444444444 | 0 |
| 0.9888888888888889 | 0 |
| 0.9895833333333334 | 0 |
| 0.9902777777777777 | 0 |
| 0.9909722222222223 | 0 |
| 0.9916666666666667 | 0 |
| 0.9923611111111111 | 0 |
| 0.9930555555555555 | 0 |
| 0.99375 | 0 |
| 0.9944444444444445 | 0 |
| 0.9951388888888889 | 0 |
| 0.9958333333333332 | 0 |
| 0.9965277777777778 | 0 |
| 0.9972222222222222 | 0 |
| 0.9979166666666667 | 0 |
| 0.998611111111111 | 0 |
| 0.9993055555555556 | 0 |